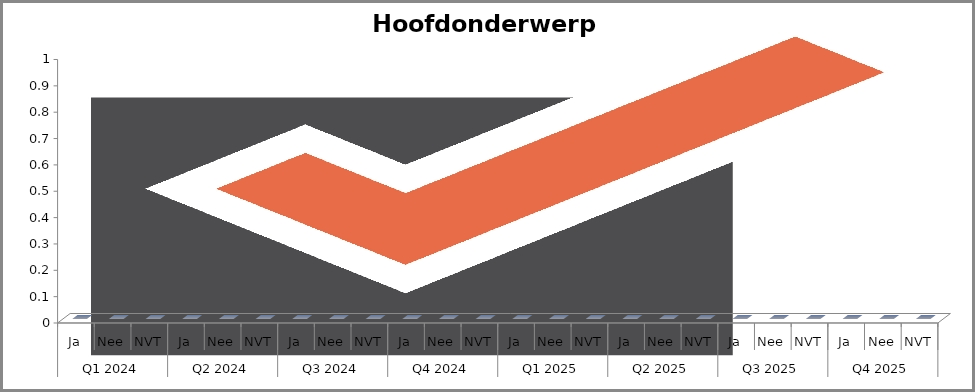
| Category | Hoofdonderwerp 1 |
|---|---|
| 0 | 0 |
| 1 | 0 |
| 2 | 0 |
| 3 | 0 |
| 4 | 0 |
| 5 | 0 |
| 6 | 0 |
| 7 | 0 |
| 8 | 0 |
| 9 | 0 |
| 10 | 0 |
| 11 | 0 |
| 12 | 0 |
| 13 | 0 |
| 14 | 0 |
| 15 | 0 |
| 16 | 0 |
| 17 | 0 |
| 18 | 0 |
| 19 | 0 |
| 20 | 0 |
| 21 | 0 |
| 22 | 0 |
| 23 | 0 |